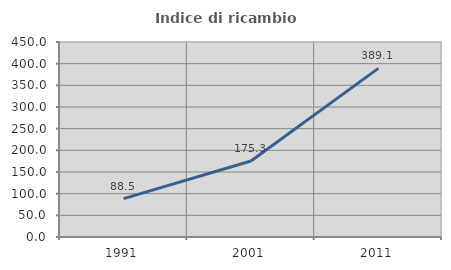
| Category | Indice di ricambio occupazionale  |
|---|---|
| 1991.0 | 88.511 |
| 2001.0 | 175.342 |
| 2011.0 | 389.13 |